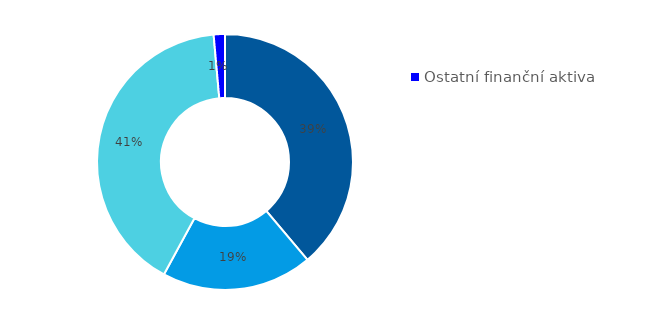
| Category | Series 0 |
|---|---|
| Hotovost | 0.389 |
| Půjčky poskytnuté nemovitostní společnosti | 0.191 |
| Majetkové účasti v nemovitostní společnosti | 0.407 |
| Ostatní finanční aktiva | 0.014 |